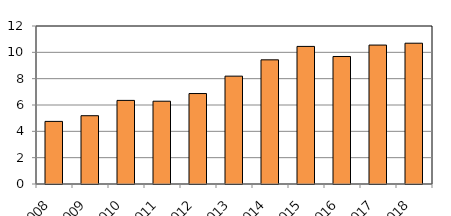
| Category | Series 1 |
|---|---|
| 2008 | 4755 |
| 2009 | 5186 |
| 2010 | 6350 |
| 2011 | 6288 |
| 2012 | 6870 |
| 2013 | 8191 |
| 2014 | 9430 |
| 2015 | 10450 |
| 2016 | 9684 |
| 2017 | 10552 |
| 2018 | 10693 |